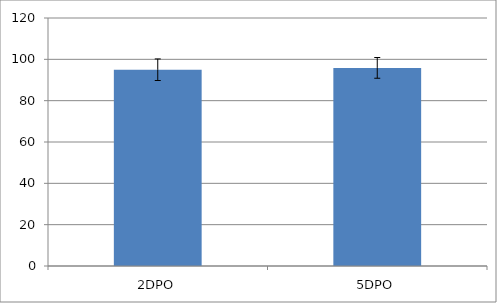
| Category | Series 0 |
|---|---|
| 2DPO | 94.972 |
| 5DPO | 95.865 |